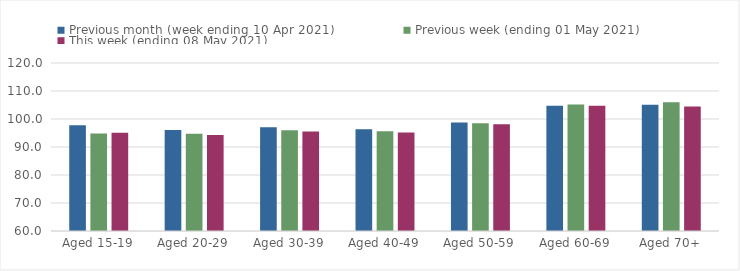
| Category | Previous month (week ending 10 Apr 2021) | Previous week (ending 01 May 2021) | This week (ending 08 May 2021) |
|---|---|---|---|
| Aged 15-19 | 97.8 | 94.85 | 95.08 |
| Aged 20-29 | 96.05 | 94.72 | 94.25 |
| Aged 30-39 | 97.01 | 95.95 | 95.5 |
| Aged 40-49 | 96.37 | 95.65 | 95.14 |
| Aged 50-59 | 98.71 | 98.47 | 98.16 |
| Aged 60-69 | 104.72 | 105.21 | 104.76 |
| Aged 70+ | 105.06 | 105.98 | 104.49 |